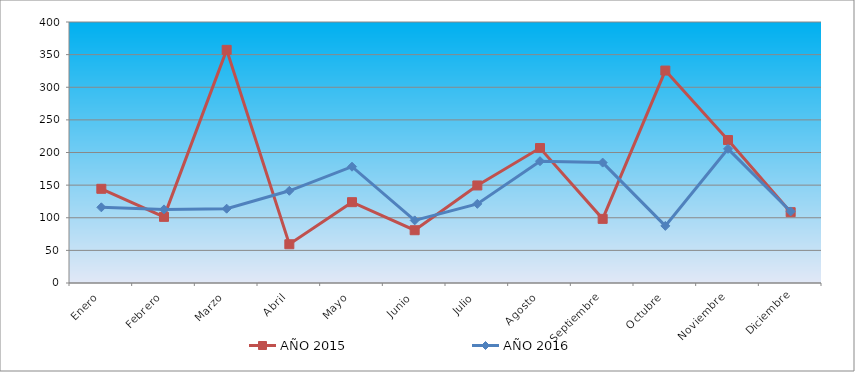
| Category | AÑO 2015 | AÑO 2016 |
|---|---|---|
| Enero | 144.36 | 115.995 |
| Febrero | 101.359 | 112.831 |
| Marzo | 357.317 | 113.886 |
| Abril | 59.382 | 141.303 |
| Mayo | 123.883 | 178.21 |
| Junio | 80.883 | 95.959 |
| Julio | 149.479 | 121.267 |
| Agosto | 206.814 | 186.646 |
| Septiembre | 98.288 | 184.537 |
| Octubre | 325.578 | 87.523 |
| Noviembre | 219.1 | 205.627 |
| Diciembre | 108.526 | 109.668 |